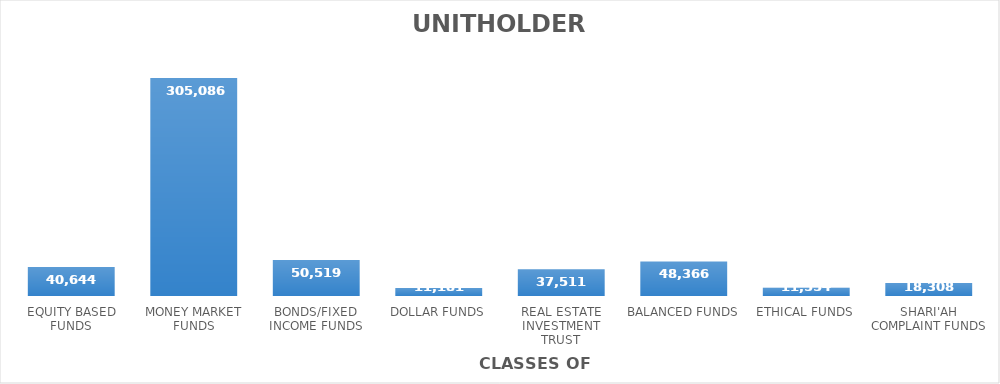
| Category | UNIT HOLDERS |
|---|---|
| EQUITY BASED FUNDS | 40644 |
| MONEY MARKET FUNDS | 305086 |
| BONDS/FIXED INCOME FUNDS | 50519 |
| DOLLAR FUNDS | 11181 |
| REAL ESTATE INVESTMENT TRUST | 37511 |
| BALANCED FUNDS | 48366 |
| ETHICAL FUNDS | 11554 |
| SHARI'AH COMPLAINT FUNDS | 18308 |